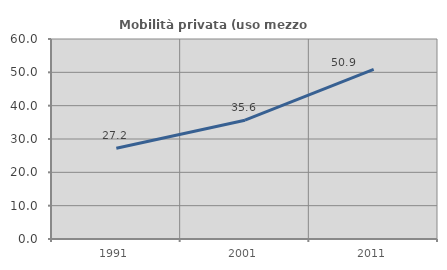
| Category | Mobilità privata (uso mezzo privato) |
|---|---|
| 1991.0 | 27.209 |
| 2001.0 | 35.647 |
| 2011.0 | 50.9 |